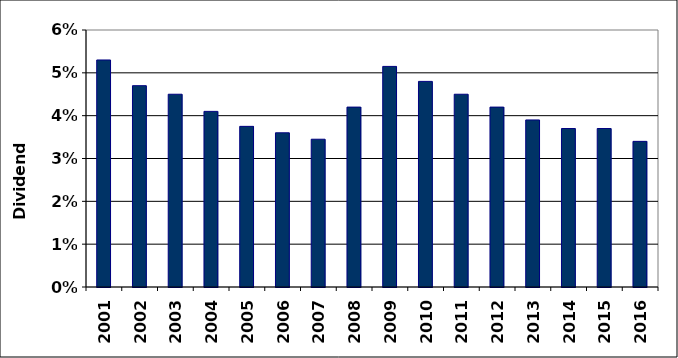
| Category | Series 0 |
|---|---|
| 2001.0 | 0.053 |
| 2002.0 | 0.047 |
| 2003.0 | 0.045 |
| 2004.0 | 0.041 |
| 2005.0 | 0.038 |
| 2006.0 | 0.036 |
| 2007.0 | 0.034 |
| 2008.0 | 0.042 |
| 2009.0 | 0.052 |
| 2010.0 | 0.048 |
| 2011.0 | 0.045 |
| 2012.0 | 0.042 |
| 2013.0 | 0.039 |
| 2014.0 | 0.037 |
| 2015.0 | 0.037 |
| 2016.0 | 0.034 |